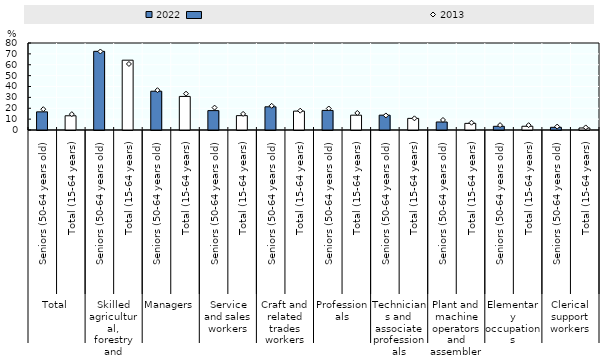
| Category | 2022 |
|---|---|
| 0 | 16.688 |
| 1 | 13.077 |
| 2 | 72.333 |
| 3 | 64.207 |
| 4 | 35.656 |
| 5 | 30.867 |
| 6 | 17.824 |
| 7 | 13.205 |
| 8 | 21.331 |
| 9 | 17.37 |
| 10 | 18.004 |
| 11 | 13.626 |
| 12 | 13.645 |
| 13 | 10.677 |
| 14 | 7.372 |
| 15 | 6.079 |
| 16 | 3.382 |
| 17 | 3.432 |
| 18 | 2.462 |
| 19 | 1.86 |